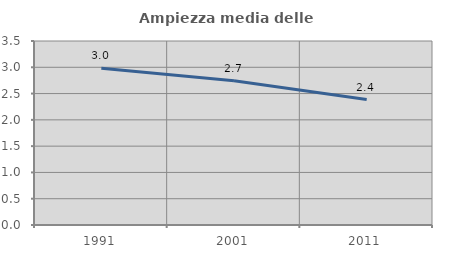
| Category | Ampiezza media delle famiglie |
|---|---|
| 1991.0 | 2.984 |
| 2001.0 | 2.744 |
| 2011.0 | 2.387 |